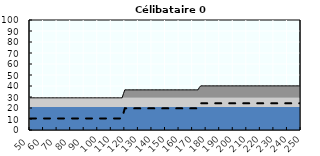
| Category | Coin fiscal marginal (somme des composantes) | Taux d’imposition marginal net |
|---|---|---|
| 50.0 | 29.249 | 10.5 |
| 51.0 | 29.249 | 10.5 |
| 52.0 | 29.249 | 10.5 |
| 53.0 | 29.249 | 10.5 |
| 54.0 | 29.249 | 10.5 |
| 55.0 | 29.249 | 10.5 |
| 56.0 | 29.249 | 10.5 |
| 57.0 | 29.249 | 10.5 |
| 58.0 | 29.249 | 10.5 |
| 59.0 | 29.249 | 10.5 |
| 60.0 | 29.249 | 10.5 |
| 61.0 | 29.249 | 10.5 |
| 62.0 | 29.249 | 10.5 |
| 63.0 | 29.249 | 10.5 |
| 64.0 | 29.249 | 10.5 |
| 65.0 | 29.249 | 10.5 |
| 66.0 | 29.249 | 10.5 |
| 67.0 | 29.249 | 10.5 |
| 68.0 | 29.249 | 10.5 |
| 69.0 | 29.249 | 10.5 |
| 70.0 | 29.249 | 10.5 |
| 71.0 | 29.249 | 10.5 |
| 72.0 | 29.249 | 10.5 |
| 73.0 | 29.249 | 10.5 |
| 74.0 | 29.249 | 10.5 |
| 75.0 | 29.249 | 10.5 |
| 76.0 | 29.249 | 10.5 |
| 77.0 | 29.249 | 10.5 |
| 78.0 | 29.249 | 10.5 |
| 79.0 | 29.249 | 10.5 |
| 80.0 | 29.249 | 10.5 |
| 81.0 | 29.249 | 10.5 |
| 82.0 | 29.249 | 10.5 |
| 83.0 | 29.249 | 10.5 |
| 84.0 | 29.249 | 10.5 |
| 85.0 | 29.249 | 10.5 |
| 86.0 | 29.249 | 10.5 |
| 87.0 | 29.249 | 10.5 |
| 88.0 | 29.249 | 10.5 |
| 89.0 | 29.249 | 10.5 |
| 90.0 | 29.249 | 10.5 |
| 91.0 | 29.249 | 10.5 |
| 92.0 | 29.249 | 10.5 |
| 93.0 | 29.249 | 10.5 |
| 94.0 | 29.249 | 10.5 |
| 95.0 | 29.249 | 10.5 |
| 96.0 | 29.249 | 10.5 |
| 97.0 | 29.249 | 10.5 |
| 98.0 | 29.249 | 10.5 |
| 99.0 | 29.249 | 10.5 |
| 100.0 | 29.249 | 10.5 |
| 101.0 | 29.249 | 10.5 |
| 102.0 | 29.249 | 10.5 |
| 103.0 | 29.249 | 10.5 |
| 104.0 | 29.249 | 10.5 |
| 105.0 | 29.249 | 10.5 |
| 106.0 | 29.249 | 10.5 |
| 107.0 | 29.249 | 10.5 |
| 108.0 | 29.249 | 10.5 |
| 109.0 | 29.249 | 10.5 |
| 110.0 | 29.249 | 10.5 |
| 111.0 | 29.249 | 10.5 |
| 112.0 | 29.249 | 10.5 |
| 113.0 | 29.249 | 10.5 |
| 114.0 | 29.249 | 10.5 |
| 115.0 | 29.249 | 10.5 |
| 116.0 | 29.249 | 10.5 |
| 117.0 | 29.249 | 10.5 |
| 118.0 | 29.249 | 10.5 |
| 119.0 | 33.15 | 15.434 |
| 120.0 | 36.504 | 19.678 |
| 121.0 | 36.504 | 19.678 |
| 122.0 | 36.504 | 19.678 |
| 123.0 | 36.504 | 19.678 |
| 124.0 | 36.504 | 19.678 |
| 125.0 | 36.504 | 19.678 |
| 126.0 | 36.504 | 19.678 |
| 127.0 | 36.504 | 19.678 |
| 128.0 | 36.504 | 19.678 |
| 129.0 | 36.504 | 19.678 |
| 130.0 | 36.504 | 19.678 |
| 131.0 | 36.504 | 19.678 |
| 132.0 | 36.504 | 19.678 |
| 133.0 | 36.504 | 19.678 |
| 134.0 | 36.504 | 19.678 |
| 135.0 | 36.504 | 19.678 |
| 136.0 | 36.504 | 19.678 |
| 137.0 | 36.504 | 19.678 |
| 138.0 | 36.504 | 19.678 |
| 139.0 | 36.504 | 19.678 |
| 140.0 | 36.504 | 19.678 |
| 141.0 | 36.504 | 19.678 |
| 142.0 | 36.504 | 19.678 |
| 143.0 | 36.504 | 19.678 |
| 144.0 | 36.504 | 19.678 |
| 145.0 | 36.504 | 19.678 |
| 146.0 | 36.504 | 19.678 |
| 147.0 | 36.504 | 19.678 |
| 148.0 | 36.504 | 19.678 |
| 149.0 | 36.504 | 19.678 |
| 150.0 | 36.504 | 19.678 |
| 151.0 | 36.504 | 19.678 |
| 152.0 | 36.504 | 19.678 |
| 153.0 | 36.504 | 19.678 |
| 154.0 | 36.504 | 19.678 |
| 155.0 | 36.504 | 19.678 |
| 156.0 | 36.504 | 19.678 |
| 157.0 | 36.504 | 19.678 |
| 158.0 | 36.504 | 19.678 |
| 159.0 | 36.504 | 19.678 |
| 160.0 | 36.504 | 19.678 |
| 161.0 | 36.504 | 19.678 |
| 162.0 | 36.504 | 19.678 |
| 163.0 | 36.504 | 19.678 |
| 164.0 | 36.504 | 19.678 |
| 165.0 | 36.504 | 19.678 |
| 166.0 | 36.504 | 19.678 |
| 167.0 | 36.504 | 19.678 |
| 168.0 | 36.504 | 19.678 |
| 169.0 | 36.504 | 19.678 |
| 170.0 | 36.504 | 19.678 |
| 171.0 | 36.504 | 19.678 |
| 172.0 | 36.504 | 19.678 |
| 173.0 | 36.504 | 19.678 |
| 174.0 | 36.504 | 19.678 |
| 175.0 | 38.729 | 22.492 |
| 176.0 | 40.132 | 24.267 |
| 177.0 | 40.132 | 24.267 |
| 178.0 | 40.132 | 24.267 |
| 179.0 | 40.132 | 24.267 |
| 180.0 | 40.132 | 24.267 |
| 181.0 | 40.132 | 24.267 |
| 182.0 | 40.132 | 24.267 |
| 183.0 | 40.132 | 24.267 |
| 184.0 | 40.132 | 24.267 |
| 185.0 | 40.132 | 24.267 |
| 186.0 | 40.132 | 24.267 |
| 187.0 | 40.132 | 24.267 |
| 188.0 | 40.132 | 24.267 |
| 189.0 | 40.132 | 24.267 |
| 190.0 | 40.132 | 24.267 |
| 191.0 | 40.132 | 24.267 |
| 192.0 | 40.132 | 24.267 |
| 193.0 | 40.132 | 24.267 |
| 194.0 | 40.132 | 24.267 |
| 195.0 | 40.132 | 24.267 |
| 196.0 | 40.132 | 24.267 |
| 197.0 | 40.132 | 24.267 |
| 198.0 | 40.132 | 24.267 |
| 199.0 | 40.132 | 24.267 |
| 200.0 | 40.132 | 24.267 |
| 201.0 | 40.132 | 24.267 |
| 202.0 | 40.132 | 24.267 |
| 203.0 | 40.132 | 24.267 |
| 204.0 | 40.132 | 24.267 |
| 205.0 | 40.132 | 24.267 |
| 206.0 | 40.132 | 24.267 |
| 207.0 | 40.132 | 24.267 |
| 208.0 | 40.132 | 24.267 |
| 209.0 | 40.132 | 24.267 |
| 210.0 | 40.132 | 24.267 |
| 211.0 | 40.132 | 24.267 |
| 212.0 | 40.132 | 24.267 |
| 213.0 | 40.132 | 24.267 |
| 214.0 | 40.132 | 24.267 |
| 215.0 | 40.132 | 24.267 |
| 216.0 | 40.132 | 24.267 |
| 217.0 | 40.132 | 24.267 |
| 218.0 | 40.132 | 24.267 |
| 219.0 | 40.132 | 24.267 |
| 220.0 | 40.132 | 24.267 |
| 221.0 | 40.132 | 24.267 |
| 222.0 | 40.132 | 24.267 |
| 223.0 | 40.132 | 24.267 |
| 224.0 | 40.132 | 24.267 |
| 225.0 | 40.132 | 24.267 |
| 226.0 | 40.132 | 24.267 |
| 227.0 | 40.132 | 24.267 |
| 228.0 | 40.132 | 24.267 |
| 229.0 | 40.132 | 24.267 |
| 230.0 | 40.132 | 24.267 |
| 231.0 | 40.132 | 24.267 |
| 232.0 | 40.132 | 24.267 |
| 233.0 | 40.132 | 24.267 |
| 234.0 | 40.132 | 24.267 |
| 235.0 | 40.132 | 24.267 |
| 236.0 | 40.132 | 24.267 |
| 237.0 | 40.132 | 24.267 |
| 238.0 | 40.132 | 24.267 |
| 239.0 | 40.132 | 24.267 |
| 240.0 | 40.132 | 24.267 |
| 241.0 | 40.132 | 24.267 |
| 242.0 | 40.132 | 24.267 |
| 243.0 | 40.132 | 24.267 |
| 244.0 | 40.132 | 24.267 |
| 245.0 | 40.132 | 24.267 |
| 246.0 | 40.132 | 24.267 |
| 247.0 | 40.132 | 24.267 |
| 248.0 | 40.132 | 24.267 |
| 249.0 | 40.132 | 24.267 |
| 250.0 | 40.132 | 24.267 |